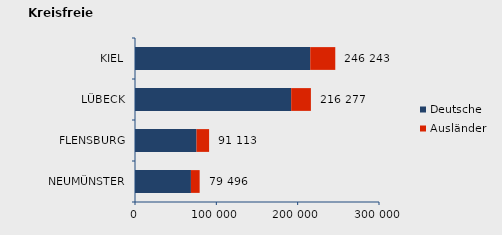
| Category | Deutsche | Ausländer | Series 2 |
|---|---|---|---|
| NEUMÜNSTER | 68760 | 10736 | 79496 |
| FLENSBURG | 75631 | 15482 | 91113 |
| LÜBECK | 192042 | 24235 | 216277 |
| KIEL | 215459 | 30784 | 246243 |